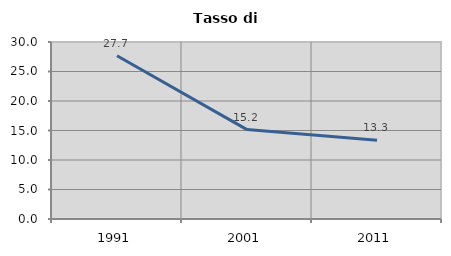
| Category | Tasso di disoccupazione   |
|---|---|
| 1991.0 | 27.673 |
| 2001.0 | 15.152 |
| 2011.0 | 13.333 |